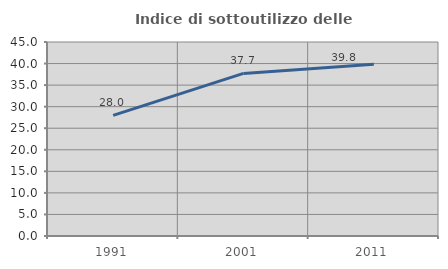
| Category | Indice di sottoutilizzo delle abitazioni  |
|---|---|
| 1991.0 | 27.983 |
| 2001.0 | 37.713 |
| 2011.0 | 39.827 |